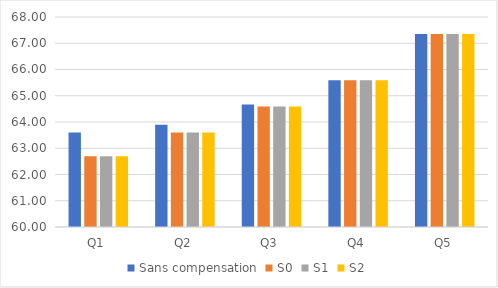
| Category | Sans compensation | S0 | S1 | S2 |
|---|---|---|---|---|
| Q1 | 63.6 | 62.7 | 62.7 | 62.7 |
| Q2 | 63.9 | 63.6 | 63.6 | 63.6 |
| Q3 | 64.67 | 64.595 | 64.595 | 64.595 |
| Q4 | 65.59 | 65.59 | 65.59 | 65.59 |
| Q5 | 67.35 | 67.35 | 67.35 | 67.35 |